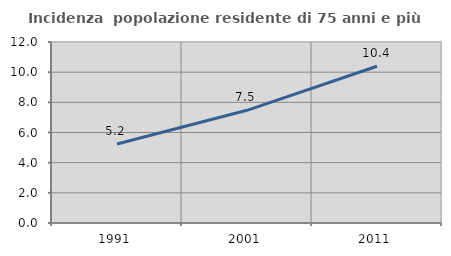
| Category | Incidenza  popolazione residente di 75 anni e più |
|---|---|
| 1991.0 | 5.242 |
| 2001.0 | 7.472 |
| 2011.0 | 10.395 |